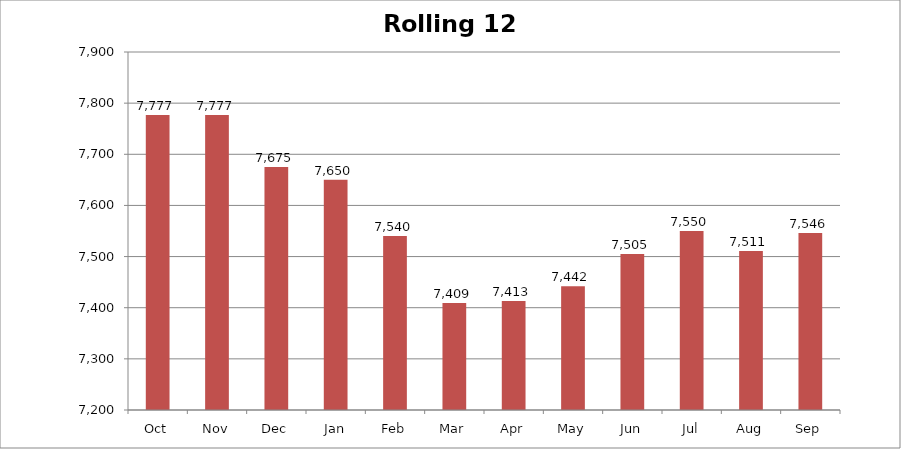
| Category | Rolling 12 Month |
|---|---|
| Oct | 7777 |
| Nov | 7777 |
| Dec | 7675 |
| Jan | 7650 |
| Feb | 7540 |
| Mar | 7409 |
| Apr | 7413 |
| May | 7442 |
| Jun | 7505 |
| Jul | 7550 |
| Aug | 7511 |
| Sep | 7546 |